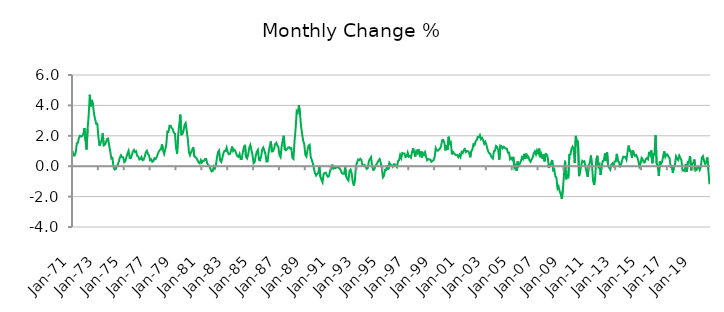
| Category | Series 0 |
|---|---|
| 1971-01-01 | 1.014 |
| 1971-02-01 | 0.711 |
| 1971-03-01 | 0.712 |
| 1971-04-01 | 0.919 |
| 1971-05-01 | 1.51 |
| 1971-06-01 | 1.551 |
| 1971-07-01 | 1.878 |
| 1971-08-01 | 2.005 |
| 1971-09-01 | 1.95 |
| 1971-10-01 | 1.987 |
| 1971-11-01 | 2.104 |
| 1971-12-01 | 2.509 |
| 1972-01-01 | 1.699 |
| 1972-02-01 | 1.094 |
| 1972-03-01 | 2.462 |
| 1972-04-01 | 3.36 |
| 1972-05-01 | 4.697 |
| 1972-06-01 | 3.937 |
| 1972-07-01 | 4.355 |
| 1972-08-01 | 4.026 |
| 1972-09-01 | 3.417 |
| 1972-10-01 | 3.088 |
| 1972-11-01 | 2.774 |
| 1972-12-01 | 2.784 |
| 1973-01-01 | 1.938 |
| 1973-02-01 | 1.343 |
| 1973-03-01 | 1.524 |
| 1973-04-01 | 1.712 |
| 1973-05-01 | 2.158 |
| 1973-06-01 | 1.373 |
| 1973-07-01 | 1.418 |
| 1973-08-01 | 1.551 |
| 1973-09-01 | 1.782 |
| 1973-10-01 | 1.816 |
| 1973-11-01 | 1.359 |
| 1973-12-01 | 0.961 |
| 1974-01-01 | 0.511 |
| 1974-02-01 | 0.548 |
| 1974-03-01 | -0.022 |
| 1974-04-01 | -0.216 |
| 1974-05-01 | -0.191 |
| 1974-06-01 | 0.007 |
| 1974-07-01 | 0.097 |
| 1974-08-01 | 0.326 |
| 1974-09-01 | 0.591 |
| 1974-10-01 | 0.722 |
| 1974-11-01 | 0.594 |
| 1974-12-01 | 0.583 |
| 1975-01-01 | 0.268 |
| 1975-02-01 | 0.337 |
| 1975-03-01 | 0.597 |
| 1975-04-01 | 0.845 |
| 1975-05-01 | 1.017 |
| 1975-06-01 | 0.539 |
| 1975-07-01 | 0.526 |
| 1975-08-01 | 0.722 |
| 1975-09-01 | 0.97 |
| 1975-10-01 | 1.067 |
| 1975-11-01 | 0.93 |
| 1975-12-01 | 0.985 |
| 1976-01-01 | 0.687 |
| 1976-02-01 | 0.643 |
| 1976-03-01 | 0.437 |
| 1976-04-01 | 0.463 |
| 1976-05-01 | 0.603 |
| 1976-06-01 | 0.392 |
| 1976-07-01 | 0.432 |
| 1976-08-01 | 0.636 |
| 1976-09-01 | 0.905 |
| 1976-10-01 | 1.011 |
| 1976-11-01 | 0.8 |
| 1976-12-01 | 0.709 |
| 1977-01-01 | 0.392 |
| 1977-02-01 | 0.448 |
| 1977-03-01 | 0.289 |
| 1977-04-01 | 0.338 |
| 1977-05-01 | 0.521 |
| 1977-06-01 | 0.47 |
| 1977-07-01 | 0.575 |
| 1977-08-01 | 0.784 |
| 1977-09-01 | 0.951 |
| 1977-10-01 | 1.061 |
| 1977-11-01 | 1.111 |
| 1977-12-01 | 1.434 |
| 1978-01-01 | 1.05 |
| 1978-02-01 | 0.811 |
| 1978-03-01 | 1.084 |
| 1978-04-01 | 1.443 |
| 1978-05-01 | 2.28 |
| 1978-06-01 | 2.255 |
| 1978-07-01 | 2.668 |
| 1978-08-01 | 2.665 |
| 1978-09-01 | 2.498 |
| 1978-10-01 | 2.424 |
| 1978-11-01 | 2.207 |
| 1978-12-01 | 2.133 |
| 1979-01-01 | 1.242 |
| 1979-02-01 | 0.823 |
| 1979-03-01 | 2.034 |
| 1979-04-01 | 2.732 |
| 1979-05-01 | 3.394 |
| 1979-06-01 | 2.083 |
| 1979-07-01 | 2.118 |
| 1979-08-01 | 2.335 |
| 1979-09-01 | 2.734 |
| 1979-10-01 | 2.841 |
| 1979-11-01 | 2.3 |
| 1979-12-01 | 1.747 |
| 1980-01-01 | 0.943 |
| 1980-02-01 | 0.726 |
| 1980-03-01 | 0.925 |
| 1980-04-01 | 1.073 |
| 1980-05-01 | 1.242 |
| 1980-06-01 | 0.656 |
| 1980-07-01 | 0.591 |
| 1980-08-01 | 0.543 |
| 1980-09-01 | 0.381 |
| 1980-10-01 | 0.243 |
| 1980-11-01 | 0.186 |
| 1980-12-01 | 0.395 |
| 1981-01-01 | 0.234 |
| 1981-02-01 | 0.354 |
| 1981-03-01 | 0.354 |
| 1981-04-01 | 0.474 |
| 1981-05-01 | 0.478 |
| 1981-06-01 | 0.161 |
| 1981-07-01 | 0.077 |
| 1981-08-01 | 0.019 |
| 1981-09-01 | -0.188 |
| 1981-10-01 | -0.344 |
| 1981-11-01 | -0.317 |
| 1981-12-01 | -0.035 |
| 1982-01-01 | -0.155 |
| 1982-02-01 | 0.068 |
| 1982-03-01 | 0.555 |
| 1982-04-01 | 0.929 |
| 1982-05-01 | 1.031 |
| 1982-06-01 | 0.372 |
| 1982-07-01 | 0.28 |
| 1982-08-01 | 0.532 |
| 1982-09-01 | 0.859 |
| 1982-10-01 | 1.012 |
| 1982-11-01 | 0.998 |
| 1982-12-01 | 1.225 |
| 1983-01-01 | 0.92 |
| 1983-02-01 | 0.783 |
| 1983-03-01 | 0.81 |
| 1983-04-01 | 0.995 |
| 1983-05-01 | 1.293 |
| 1983-06-01 | 1.001 |
| 1983-07-01 | 1.08 |
| 1983-08-01 | 1.015 |
| 1983-09-01 | 0.803 |
| 1983-10-01 | 0.652 |
| 1983-11-01 | 0.611 |
| 1983-12-01 | 0.798 |
| 1984-01-01 | 0.473 |
| 1984-02-01 | 0.478 |
| 1984-03-01 | 0.903 |
| 1984-04-01 | 1.241 |
| 1984-05-01 | 1.404 |
| 1984-06-01 | 0.614 |
| 1984-07-01 | 0.511 |
| 1984-08-01 | 0.774 |
| 1984-09-01 | 1.225 |
| 1984-10-01 | 1.401 |
| 1984-11-01 | 1.068 |
| 1984-12-01 | 0.734 |
| 1985-01-01 | 0.202 |
| 1985-02-01 | 0.279 |
| 1985-03-01 | 0.684 |
| 1985-04-01 | 0.954 |
| 1985-05-01 | 1.079 |
| 1985-06-01 | 0.413 |
| 1985-07-01 | 0.38 |
| 1985-08-01 | 0.656 |
| 1985-09-01 | 1.087 |
| 1985-10-01 | 1.228 |
| 1985-11-01 | 1.02 |
| 1985-12-01 | 0.807 |
| 1986-01-01 | 0.311 |
| 1986-02-01 | 0.317 |
| 1986-03-01 | 0.923 |
| 1986-04-01 | 1.322 |
| 1986-05-01 | 1.629 |
| 1986-06-01 | 0.97 |
| 1986-07-01 | 0.982 |
| 1986-08-01 | 1.161 |
| 1986-09-01 | 1.443 |
| 1986-10-01 | 1.536 |
| 1986-11-01 | 1.373 |
| 1986-12-01 | 1.263 |
| 1987-01-01 | 0.724 |
| 1987-02-01 | 0.595 |
| 1987-03-01 | 1.283 |
| 1987-04-01 | 1.705 |
| 1987-05-01 | 2.003 |
| 1987-06-01 | 1.108 |
| 1987-07-01 | 1.049 |
| 1987-08-01 | 1.142 |
| 1987-09-01 | 1.226 |
| 1987-10-01 | 1.253 |
| 1987-11-01 | 1.16 |
| 1987-12-01 | 1.188 |
| 1988-01-01 | 0.558 |
| 1988-02-01 | 0.478 |
| 1988-03-01 | 1.666 |
| 1988-04-01 | 2.466 |
| 1988-05-01 | 3.62 |
| 1988-06-01 | 3.526 |
| 1988-07-01 | 4.01 |
| 1988-08-01 | 3.546 |
| 1988-09-01 | 2.637 |
| 1988-10-01 | 2.133 |
| 1988-11-01 | 1.68 |
| 1988-12-01 | 1.467 |
| 1989-01-01 | 0.756 |
| 1989-02-01 | 0.634 |
| 1989-03-01 | 1.069 |
| 1989-04-01 | 1.347 |
| 1989-05-01 | 1.408 |
| 1989-06-01 | 0.607 |
| 1989-07-01 | 0.411 |
| 1989-08-01 | 0.192 |
| 1989-09-01 | -0.165 |
| 1989-10-01 | -0.462 |
| 1989-11-01 | -0.618 |
| 1989-12-01 | -0.507 |
| 1990-01-01 | -0.459 |
| 1990-02-01 | -0.019 |
| 1990-03-01 | -0.686 |
| 1990-04-01 | -0.897 |
| 1990-05-01 | -1.058 |
| 1990-06-01 | -0.51 |
| 1990-07-01 | -0.437 |
| 1990-08-01 | -0.428 |
| 1990-09-01 | -0.604 |
| 1990-10-01 | -0.695 |
| 1990-11-01 | -0.649 |
| 1990-12-01 | -0.278 |
| 1991-01-01 | -0.196 |
| 1991-02-01 | 0.105 |
| 1991-03-01 | -0.159 |
| 1991-04-01 | -0.105 |
| 1991-05-01 | -0.139 |
| 1991-06-01 | -0.062 |
| 1991-07-01 | -0.066 |
| 1991-08-01 | -0.093 |
| 1991-09-01 | -0.159 |
| 1991-10-01 | -0.285 |
| 1991-11-01 | -0.467 |
| 1991-12-01 | -0.497 |
| 1992-01-01 | -0.494 |
| 1992-02-01 | -0.076 |
| 1992-03-01 | -0.697 |
| 1992-04-01 | -0.848 |
| 1992-05-01 | -0.944 |
| 1992-06-01 | -0.312 |
| 1992-07-01 | -0.225 |
| 1992-08-01 | -0.473 |
| 1992-09-01 | -1.015 |
| 1992-10-01 | -1.272 |
| 1992-11-01 | -0.873 |
| 1992-12-01 | 0.026 |
| 1993-01-01 | 0.247 |
| 1993-02-01 | 0.437 |
| 1993-03-01 | 0.391 |
| 1993-04-01 | 0.487 |
| 1993-05-01 | 0.413 |
| 1993-06-01 | 0.047 |
| 1993-07-01 | 0.03 |
| 1993-08-01 | 0.082 |
| 1993-09-01 | -0.063 |
| 1993-10-01 | -0.18 |
| 1993-11-01 | -0.118 |
| 1993-12-01 | 0.35 |
| 1994-01-01 | 0.48 |
| 1994-02-01 | 0.595 |
| 1994-03-01 | -0.023 |
| 1994-04-01 | -0.241 |
| 1994-05-01 | -0.212 |
| 1994-06-01 | 0.019 |
| 1994-07-01 | 0.12 |
| 1994-08-01 | 0.247 |
| 1994-09-01 | 0.391 |
| 1994-10-01 | 0.472 |
| 1994-11-01 | 0.222 |
| 1994-12-01 | -0.131 |
| 1995-01-01 | -0.733 |
| 1995-02-01 | -0.635 |
| 1995-03-01 | -0.24 |
| 1995-04-01 | -0.251 |
| 1995-05-01 | 0.043 |
| 1995-06-01 | -0.212 |
| 1995-07-01 | 0.218 |
| 1995-08-01 | 0.097 |
| 1995-09-01 | 0.057 |
| 1995-10-01 | -0.036 |
| 1995-11-01 | 0.126 |
| 1995-12-01 | 0.123 |
| 1996-01-01 | 0.036 |
| 1996-02-01 | -0.061 |
| 1996-03-01 | 0.33 |
| 1996-04-01 | 0.389 |
| 1996-05-01 | 0.736 |
| 1996-06-01 | 0.535 |
| 1996-07-01 | 0.868 |
| 1996-08-01 | 0.833 |
| 1996-09-01 | 0.834 |
| 1996-10-01 | 0.603 |
| 1996-11-01 | 0.635 |
| 1996-12-01 | 0.892 |
| 1997-01-01 | 0.634 |
| 1997-02-01 | 0.672 |
| 1997-03-01 | 0.57 |
| 1997-04-01 | 0.919 |
| 1997-05-01 | 1.19 |
| 1997-06-01 | 0.893 |
| 1997-07-01 | 0.625 |
| 1997-08-01 | 0.99 |
| 1997-09-01 | 0.877 |
| 1997-10-01 | 1.126 |
| 1997-11-01 | 0.779 |
| 1997-12-01 | 0.981 |
| 1998-01-01 | 0.576 |
| 1998-02-01 | 0.861 |
| 1998-03-01 | 0.744 |
| 1998-04-01 | 0.917 |
| 1998-05-01 | 0.646 |
| 1998-06-01 | 0.394 |
| 1998-07-01 | 0.47 |
| 1998-08-01 | 0.438 |
| 1998-09-01 | 0.441 |
| 1998-10-01 | 0.291 |
| 1998-11-01 | 0.339 |
| 1998-12-01 | 0.406 |
| 1999-01-01 | 0.599 |
| 1999-02-01 | 1.189 |
| 1999-03-01 | 1.036 |
| 1999-04-01 | 1.017 |
| 1999-05-01 | 1.102 |
| 1999-06-01 | 1.154 |
| 1999-07-01 | 1.343 |
| 1999-08-01 | 1.715 |
| 1999-09-01 | 1.719 |
| 1999-10-01 | 1.552 |
| 1999-11-01 | 1.038 |
| 1999-12-01 | 1.38 |
| 2000-01-01 | 1.085 |
| 2000-02-01 | 1.936 |
| 2000-03-01 | 1.491 |
| 2000-04-01 | 1.566 |
| 2000-05-01 | 0.781 |
| 2000-06-01 | 0.949 |
| 2000-07-01 | 0.839 |
| 2000-08-01 | 0.775 |
| 2000-09-01 | 0.714 |
| 2000-10-01 | 0.729 |
| 2000-11-01 | 0.596 |
| 2000-12-01 | 0.754 |
| 2001-01-01 | 0.606 |
| 2001-02-01 | 0.935 |
| 2001-03-01 | 0.867 |
| 2001-04-01 | 1.055 |
| 2001-05-01 | 1.127 |
| 2001-06-01 | 0.924 |
| 2001-07-01 | 0.998 |
| 2001-08-01 | 0.985 |
| 2001-09-01 | 0.883 |
| 2001-10-01 | 0.588 |
| 2001-11-01 | 0.997 |
| 2001-12-01 | 1.094 |
| 2002-01-01 | 1.445 |
| 2002-02-01 | 1.384 |
| 2002-03-01 | 1.631 |
| 2002-04-01 | 1.728 |
| 2002-05-01 | 1.918 |
| 2002-06-01 | 1.906 |
| 2002-07-01 | 2.048 |
| 2002-08-01 | 1.783 |
| 2002-09-01 | 1.859 |
| 2002-10-01 | 1.71 |
| 2002-11-01 | 1.477 |
| 2002-12-01 | 1.602 |
| 2003-01-01 | 1.407 |
| 2003-02-01 | 1.139 |
| 2003-03-01 | 0.91 |
| 2003-04-01 | 0.863 |
| 2003-05-01 | 0.726 |
| 2003-06-01 | 0.579 |
| 2003-07-01 | 0.508 |
| 2003-08-01 | 0.993 |
| 2003-09-01 | 1.027 |
| 2003-10-01 | 1.329 |
| 2003-11-01 | 1.273 |
| 2003-12-01 | 1.053 |
| 2004-01-01 | 0.433 |
| 2004-02-01 | 1.358 |
| 2004-03-01 | 1.317 |
| 2004-04-01 | 1.179 |
| 2004-05-01 | 1.278 |
| 2004-06-01 | 1.218 |
| 2004-07-01 | 1.163 |
| 2004-08-01 | 1.146 |
| 2004-09-01 | 0.887 |
| 2004-10-01 | 0.892 |
| 2004-11-01 | 0.464 |
| 2004-12-01 | 0.546 |
| 2005-01-01 | 0.433 |
| 2005-02-01 | 0.615 |
| 2005-03-01 | -0.094 |
| 2005-04-01 | 0.035 |
| 2005-05-01 | -0.308 |
| 2005-06-01 | 0.31 |
| 2005-07-01 | 0.014 |
| 2005-08-01 | 0.163 |
| 2005-09-01 | 0.324 |
| 2005-10-01 | 0.577 |
| 2005-11-01 | 0.466 |
| 2005-12-01 | 0.812 |
| 2006-01-01 | 0.5 |
| 2006-02-01 | 0.828 |
| 2006-03-01 | 0.563 |
| 2006-04-01 | 0.621 |
| 2006-05-01 | 0.386 |
| 2006-06-01 | 0.291 |
| 2006-07-01 | 0.438 |
| 2006-08-01 | 0.591 |
| 2006-09-01 | 0.848 |
| 2006-10-01 | 0.979 |
| 2006-11-01 | 0.775 |
| 2006-12-01 | 1.037 |
| 2007-01-01 | 0.858 |
| 2007-02-01 | 1.157 |
| 2007-03-01 | 0.591 |
| 2007-04-01 | 0.791 |
| 2007-05-01 | 0.495 |
| 2007-06-01 | 0.773 |
| 2007-07-01 | 0.314 |
| 2007-08-01 | 0.802 |
| 2007-09-01 | 0.779 |
| 2007-10-01 | 0.566 |
| 2007-11-01 | -0.121 |
| 2007-12-01 | 0.07 |
| 2008-01-01 | 0.193 |
| 2008-02-01 | 0.407 |
| 2008-03-01 | -0.27 |
| 2008-04-01 | -0.198 |
| 2008-05-01 | -0.666 |
| 2008-06-01 | -0.763 |
| 2008-07-01 | -1.456 |
| 2008-08-01 | -1.333 |
| 2008-09-01 | -1.666 |
| 2008-10-01 | -1.827 |
| 2008-11-01 | -2.152 |
| 2008-12-01 | -1.511 |
| 2009-01-01 | -0.593 |
| 2009-02-01 | 0.356 |
| 2009-03-01 | -0.862 |
| 2009-04-01 | -0.536 |
| 2009-05-01 | -0.786 |
| 2009-06-01 | 0.762 |
| 2009-07-01 | 0.77 |
| 2009-08-01 | 1.139 |
| 2009-09-01 | 1.284 |
| 2009-10-01 | 1.145 |
| 2009-11-01 | 0.204 |
| 2009-12-01 | 1.994 |
| 2010-01-01 | 1.536 |
| 2010-02-01 | 1.676 |
| 2010-03-01 | -0.651 |
| 2010-04-01 | -0.342 |
| 2010-05-01 | 0.049 |
| 2010-06-01 | 0.354 |
| 2010-07-01 | 0.283 |
| 2010-08-01 | 0.323 |
| 2010-09-01 | -0.047 |
| 2010-10-01 | -0.391 |
| 2010-11-01 | -0.701 |
| 2010-12-01 | 0.034 |
| 2011-01-01 | 0.244 |
| 2011-02-01 | 0.703 |
| 2011-03-01 | 0.059 |
| 2011-04-01 | -0.947 |
| 2011-05-01 | -1.241 |
| 2011-06-01 | -0.69 |
| 2011-07-01 | 0.458 |
| 2011-08-01 | 0.687 |
| 2011-09-01 | -0.023 |
| 2011-10-01 | 0.118 |
| 2011-11-01 | -0.58 |
| 2011-12-01 | 0.04 |
| 2012-01-01 | 0.333 |
| 2012-02-01 | 0.371 |
| 2012-03-01 | 0.836 |
| 2012-04-01 | 0.354 |
| 2012-05-01 | 0.924 |
| 2012-06-01 | -0.009 |
| 2012-07-01 | -0.101 |
| 2012-08-01 | -0.222 |
| 2012-09-01 | 0.107 |
| 2012-10-01 | 0.182 |
| 2012-11-01 | 0.049 |
| 2012-12-01 | 0.313 |
| 2013-01-01 | 0.306 |
| 2013-02-01 | 0.812 |
| 2013-03-01 | 0.345 |
| 2013-04-01 | 0.271 |
| 2013-05-01 | -0.069 |
| 2013-06-01 | 0.154 |
| 2013-07-01 | 0.387 |
| 2013-08-01 | 0.627 |
| 2013-09-01 | 0.614 |
| 2013-10-01 | 0.608 |
| 2013-11-01 | 0.433 |
| 2013-12-01 | 0.932 |
| 2014-01-01 | 1.351 |
| 2014-02-01 | 0.99 |
| 2014-03-01 | 1.002 |
| 2014-04-01 | 0.559 |
| 2014-05-01 | 1.028 |
| 2014-06-01 | 0.79 |
| 2014-07-01 | 0.675 |
| 2014-08-01 | 0.734 |
| 2014-09-01 | 0.578 |
| 2014-10-01 | 0.359 |
| 2014-11-01 | -0.016 |
| 2014-12-01 | 0.161 |
| 2015-01-01 | 0.547 |
| 2015-02-01 | 0.467 |
| 2015-03-01 | 0.257 |
| 2015-04-01 | 0.25 |
| 2015-05-01 | 0.484 |
| 2015-06-01 | 0.532 |
| 2015-07-01 | 0.454 |
| 2015-08-01 | 0.94 |
| 2015-09-01 | 0.754 |
| 2015-10-01 | 1.045 |
| 2015-11-01 | 0.196 |
| 2015-12-01 | 0.79 |
| 2016-01-01 | 0.777 |
| 2016-02-01 | 2.042 |
| 2016-03-01 | 0.162 |
| 2016-04-01 | 0.005 |
| 2016-05-01 | -0.638 |
| 2016-06-01 | 0.315 |
| 2016-07-01 | 0.149 |
| 2016-08-01 | 0.276 |
| 2016-09-01 | 0.638 |
| 2016-10-01 | 0.971 |
| 2016-11-01 | 0.611 |
| 2016-12-01 | 0.773 |
| 2017-01-01 | 0.778 |
| 2017-02-01 | 0.608 |
| 2017-03-01 | 0.525 |
| 2017-04-01 | -0.033 |
| 2017-05-01 | -0.003 |
| 2017-06-01 | -0.431 |
| 2017-07-01 | -0.06 |
| 2017-08-01 | 0.117 |
| 2017-09-01 | 0.643 |
| 2017-10-01 | 0.49 |
| 2017-11-01 | 0.401 |
| 2017-12-01 | 0.694 |
| 2018-01-01 | 0.546 |
| 2018-02-01 | 0.383 |
| 2018-03-01 | -0.286 |
| 2018-04-01 | -0.269 |
| 2018-05-01 | -0.322 |
| 2018-06-01 | 0.146 |
| 2018-07-01 | -0.37 |
| 2018-08-01 | 0.285 |
| 2018-09-01 | 0.297 |
| 2018-10-01 | 0.665 |
| 2018-11-01 | -0.272 |
| 2018-12-01 | 0.184 |
| 2019-01-01 | 0.192 |
| 2019-02-01 | 0.441 |
| 2019-03-01 | -0.286 |
| 2019-04-01 | -0.253 |
| 2019-05-01 | -0.049 |
| 2019-06-01 | -0.065 |
| 2019-07-01 | -0.242 |
| 2019-08-01 | -0.028 |
| 2019-09-01 | 0.569 |
| 2019-10-01 | 0.66 |
| 2019-11-01 | 0.35 |
| 2019-12-01 | 0.155 |
| 2020-01-01 | 0.258 |
| 2020-02-01 | 0.578 |
| 2020-03-01 | -0.265 |
| 2020-04-01 | -1.192 |